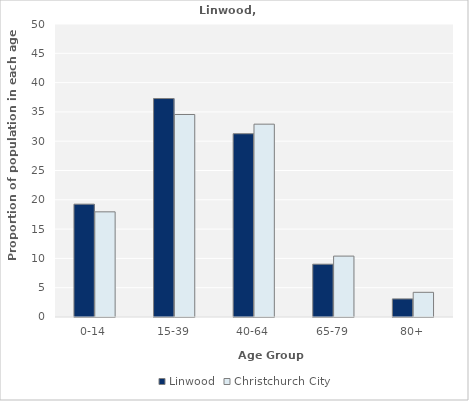
| Category | Linwood | Christchurch City |
|---|---|---|
| 0-14 | 19.259 | 17.945 |
| 15-39 | 37.284 | 34.556 |
| 40-64 | 31.276 | 32.907 |
| 65-79 | 9.012 | 10.392 |
| 80+ | 3.086 | 4.211 |